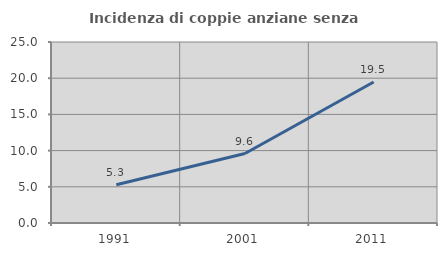
| Category | Incidenza di coppie anziane senza figli  |
|---|---|
| 1991.0 | 5.276 |
| 2001.0 | 9.596 |
| 2011.0 | 19.474 |